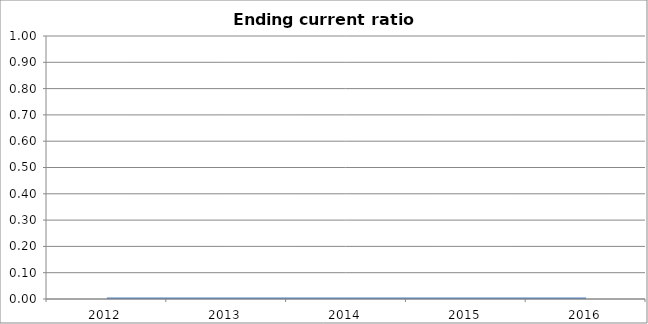
| Category | Ending current ratio [A/B] |
|---|---|
| 2012.0 | 0 |
| 2013.0 | 0 |
| 2014.0 | 0 |
| 2015.0 | 0 |
| 2016.0 | 0 |